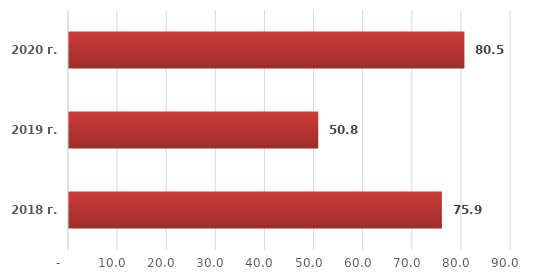
| Category | Series 0 |
|---|---|
| 2018 г. | 75.935 |
| 2019 г. | 50.753 |
| 2020 г. | 80.512 |